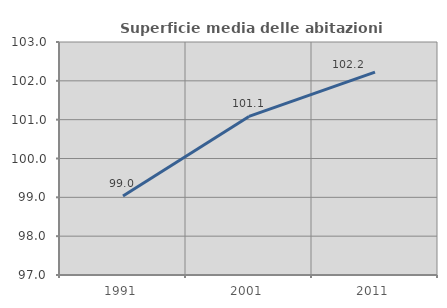
| Category | Superficie media delle abitazioni occupate |
|---|---|
| 1991.0 | 99.035 |
| 2001.0 | 101.084 |
| 2011.0 | 102.225 |